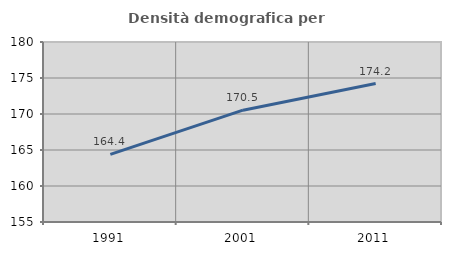
| Category | Densità demografica |
|---|---|
| 1991.0 | 164.393 |
| 2001.0 | 170.531 |
| 2011.0 | 174.236 |